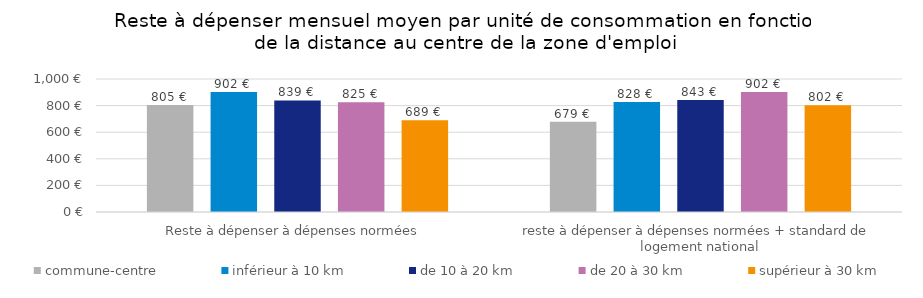
| Category | commune-centre | inférieur à 10 km | de 10 à 20 km | de 20 à 30 km | supérieur à 30 km |
|---|---|---|---|---|---|
| Reste à dépenser à dépenses normées | 805 | 902 | 839 | 825 | 689 |
| reste à dépenser à dépenses normées + standard de logement national | 679 | 828 | 843 | 902 | 802 |